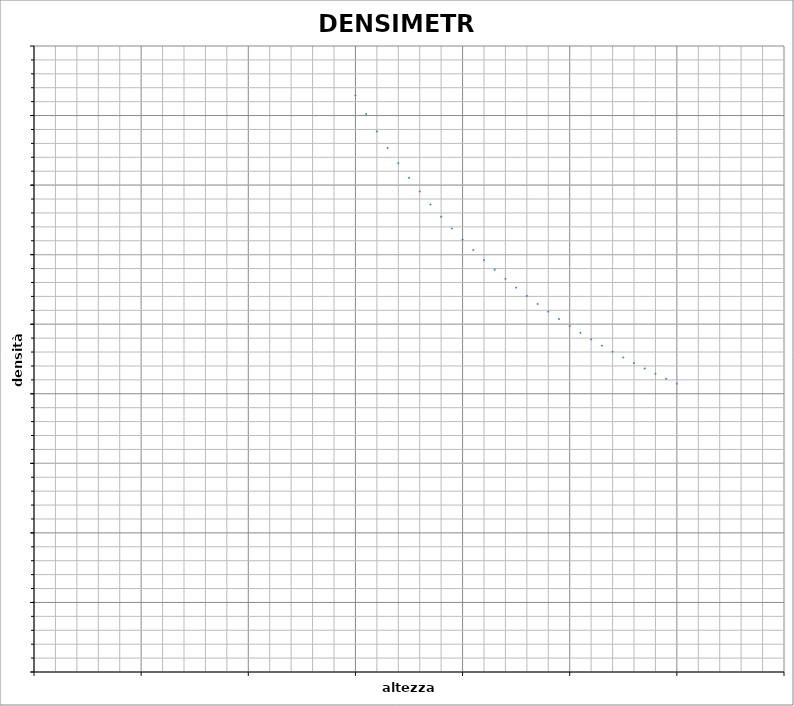
| Category | Series 0 |
|---|---|
| 6.0 | 1.658 |
| 6.2 | 1.604 |
| 6.4 | 1.554 |
| 6.6 | 1.507 |
| 6.8 | 1.463 |
| 7.0 | 1.421 |
| 7.2 | 1.382 |
| 7.4 | 1.344 |
| 7.6 | 1.309 |
| 7.8 | 1.275 |
| 8.0 | 1.243 |
| 8.2 | 1.213 |
| 8.4 | 1.184 |
| 8.6 | 1.157 |
| 8.8 | 1.13 |
| 9.0 | 1.105 |
| 9.2 | 1.081 |
| 9.4 | 1.058 |
| 9.6 | 1.036 |
| 9.8 | 1.015 |
| 10.0 | 0.995 |
| 10.2 | 0.975 |
| 10.4 | 0.956 |
| 10.6 | 0.938 |
| 10.8 | 0.921 |
| 11.0 | 0.904 |
| 11.2 | 0.888 |
| 11.4 | 0.873 |
| 11.6 | 0.858 |
| 11.8 | 0.843 |
| 12.0 | 0.829 |